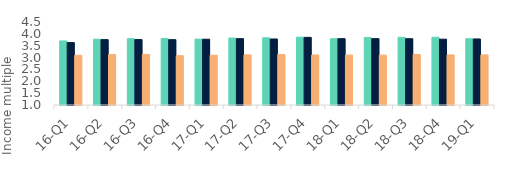
| Category | First-time
buyers | Homemovers | Homowner remortgaging |
|---|---|---|---|
| 16-Q1 | 3.701 | 3.632 | 3.097 |
| 16-Q2 | 3.775 | 3.757 | 3.125 |
| 16-Q3 | 3.797 | 3.759 | 3.134 |
| 16-Q4 | 3.802 | 3.755 | 3.08 |
| 17-Q1 | 3.778 | 3.774 | 3.099 |
| 17-Q2 | 3.822 | 3.797 | 3.115 |
| 17-Q3 | 3.835 | 3.784 | 3.128 |
| 17-Q4 | 3.861 | 3.852 | 3.11 |
| 18-Q1 | 3.795 | 3.797 | 3.105 |
| 18-Q2 | 3.844 | 3.798 | 3.103 |
| 18-Q3 | 3.856 | 3.795 | 3.128 |
| 18-Q4 | 3.856 | 3.775 | 3.112 |
| 19-Q1 | 3.794 | 3.784 | 3.112 |